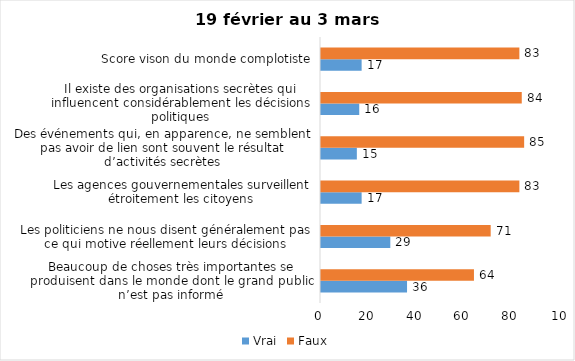
| Category | Vrai | Faux |
|---|---|---|
| Beaucoup de choses très importantes se produisent dans le monde dont le grand public n’est pas informé | 36 | 64 |
| Les politiciens ne nous disent généralement pas ce qui motive réellement leurs décisions | 29 | 71 |
| Les agences gouvernementales surveillent étroitement les citoyens | 17 | 83 |
| Des événements qui, en apparence, ne semblent pas avoir de lien sont souvent le résultat d’activités secrètes | 15 | 85 |
| Il existe des organisations secrètes qui influencent considérablement les décisions politiques | 16 | 84 |
| Score vison du monde complotiste | 17 | 83 |